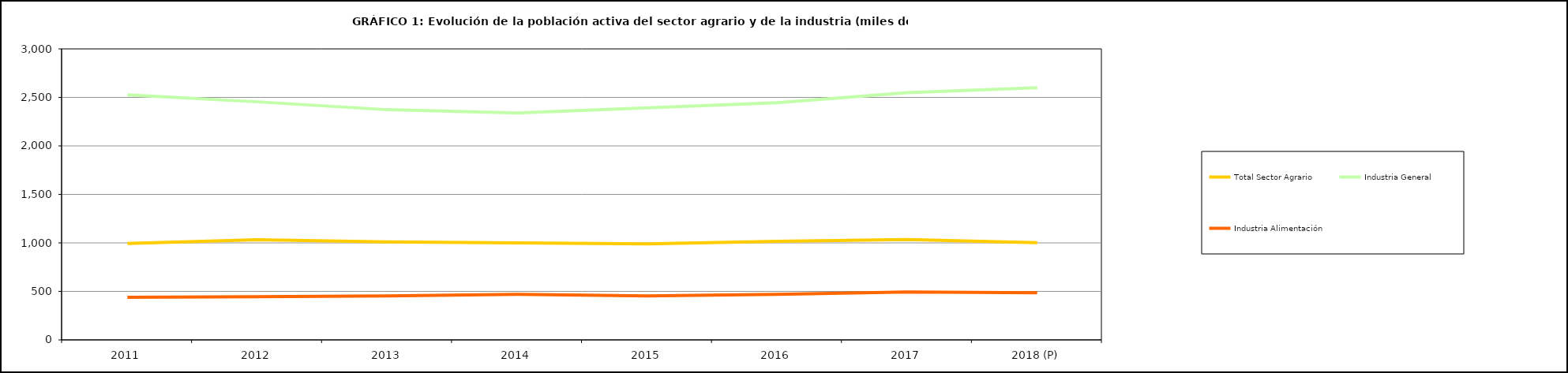
| Category | Total Sector Agrario | Industria General | Industria Alimentación |
|---|---|---|---|
| 2011 | 993.225 | 2525.825 | 439.575 |
| 2012 | 1032.125 | 2454.25 | 445.725 |
| 2013 | 1010.5 | 2372.975 | 454.075 |
| 2014 | 1000.9 | 2339.7 | 468.5 |
| 2015 | 990.325 | 2391.725 | 454.1 |
| 2016 | 1016.75 | 2445.73 | 468.93 |
| 2017 | 1034 | 2548.2 | 494.3 |
| 2018 (P) | 1002.675 | 2599.175 | 485.3 |